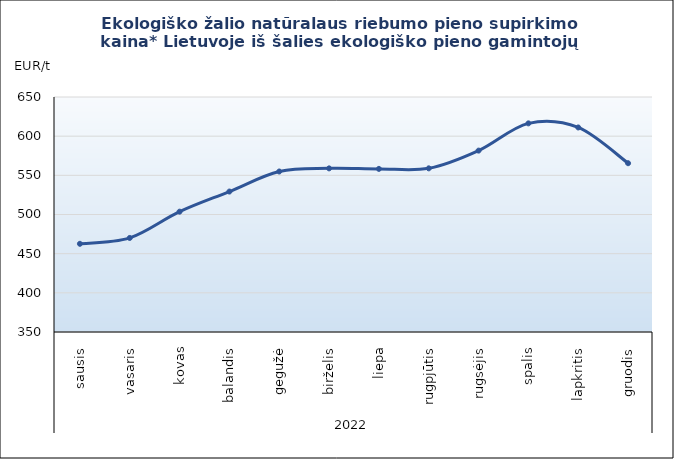
| Category | Ekologiško žalio natūralaus riebumo pieno supirkimo kaina* Lietuvoje iš šalies ekologiško pieno gamintojų |
|---|---|
| 0 | 462.59 |
| 1 | 470.07 |
| 2 | 503.61 |
| 3 | 529.3 |
| 4 | 554.9 |
| 5 | 558.89 |
| 6 | 558.23 |
| 7 | 558.92 |
| 8 | 581.56 |
| 9 | 616.34 |
| 10 | 611.11 |
| 11 | 565.47 |